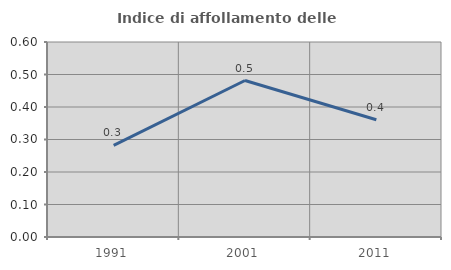
| Category | Indice di affollamento delle abitazioni  |
|---|---|
| 1991.0 | 0.282 |
| 2001.0 | 0.482 |
| 2011.0 | 0.361 |